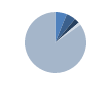
| Category | Series 0 |
|---|---|
| 0 | 42 |
| 1 | 34 |
| 2 | 18 |
| 3 | 10 |
| 4 | 584 |